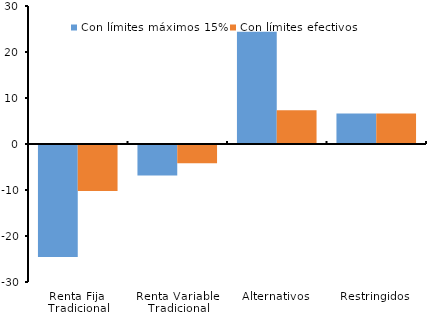
| Category | Con límites máximos 15% | Con límites efectivos |
|---|---|---|
| Renta Fija 
Tradicional | -24.366 | -9.975 |
| Renta Variable 
Tradicional | -6.651 | -3.962 |
| Alternativos | 24.396 | 7.317 |
| Restringidos  | 6.62 | 6.62 |